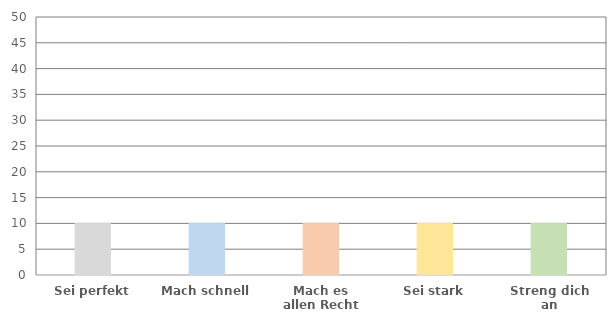
| Category | Punkte |
|---|---|
| Sei perfekt | 10 |
| Mach schnell | 10 |
| Mach es allen Recht | 10 |
| Sei stark | 10 |
| Streng dich an | 10 |